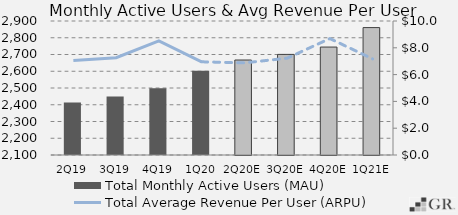
| Category | Total Monthly Active Users (MAU)  |
|---|---|
|  2Q19  | 2414 |
|  3Q19  | 2449 |
|  4Q19  | 2497.8 |
|  1Q20  | 2603 |
|  2Q20E  | 2667.12 |
|  3Q20E  | 2700.61 |
|  4Q20E  | 2744.422 |
|  1Q21E  | 2860.72 |